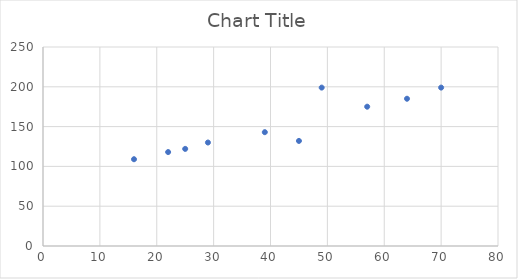
| Category | Series 0 |
|---|---|
| 16.0 | 109 |
| 25.0 | 122 |
| 39.0 | 143 |
| 45.0 | 132 |
| 49.0 | 199 |
| 64.0 | 185 |
| 70.0 | 199 |
| 29.0 | 130 |
| 57.0 | 175 |
| 22.0 | 118 |